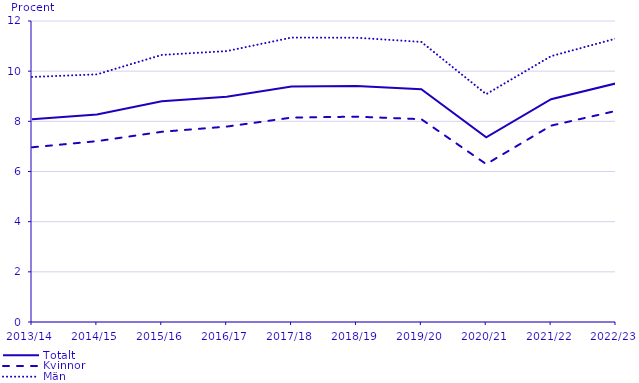
| Category | Totalt | Kvinnor | Män |
|---|---|---|---|
| 2013/14 | 8.081 | 6.964 | 9.769 |
| 2014/15 | 8.273 | 7.209 | 9.873 |
| 2015/16 | 8.8 | 7.584 | 10.648 |
| 2016/17 | 8.977 | 7.79 | 10.8 |
| 2017/18 | 9.39 | 8.149 | 11.339 |
| 2018/19 | 9.409 | 8.186 | 11.333 |
| 2019/20 | 9.278 | 8.085 | 11.167 |
| 2020/21 | 7.36 | 6.294 | 9.083 |
| 2021/22 | 8.882 | 7.829 | 10.599 |
| 2022/23 | 9.512 | 8.416 | 11.3 |